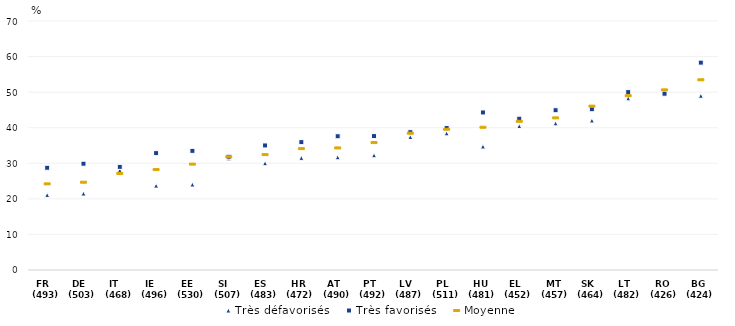
| Category | Très défavorisés | Très favorisés | Moyenne |
|---|---|---|---|
| FR   (493) | 21.11 | 28.74 | 24.21 |
| DE   (503) | 21.49 | 29.88 | 24.68 |
| IT    (468) | 28.03 | 28.99 | 27.147 |
| IE    (496) | 23.72 | 32.86 | 28.231 |
| EE   (530) | 24.04 | 33.49 | 29.768 |
| SI    (507) | 31.39 | 31.83 | 31.827 |
| ES   (483) | 30.02 | 35.01 | 32.441 |
| HR  (472) | 31.52 | 35.95 | 34.125 |
| AT   (490) | 31.7 | 37.6 | 34.318 |
| PT   (492) | 32.26 | 37.65 | 35.826 |
| LV   (487) | 37.39 | 38.74 | 38.46 |
| PL   (511) | 38.42 | 39.91 | 39.574 |
| HU  (481) | 34.73 | 44.29 | 40.127 |
| EL   (452) | 40.46 | 42.53 | 41.8 |
| MT  (457) | 41.23 | 44.92 | 42.769 |
| SK   (464) | 42.04 | 45.2 | 46.062 |
| LT   (482) | 48.26 | 50.01 | 49.002 |
| RO  (426) | 50.4 | 49.55 | 50.636 |
| BG  (424) | 48.99 | 58.29 | 53.47 |